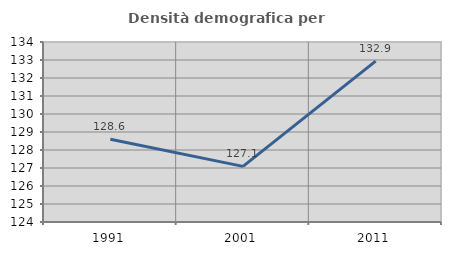
| Category | Densità demografica |
|---|---|
| 1991.0 | 128.601 |
| 2001.0 | 127.089 |
| 2011.0 | 132.935 |